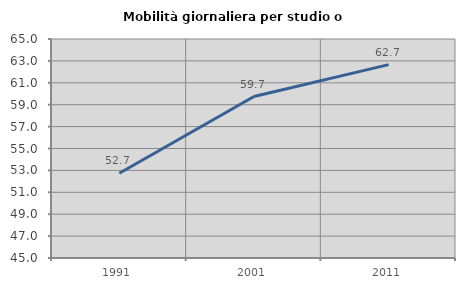
| Category | Mobilità giornaliera per studio o lavoro |
|---|---|
| 1991.0 | 52.74 |
| 2001.0 | 59.746 |
| 2011.0 | 62.661 |